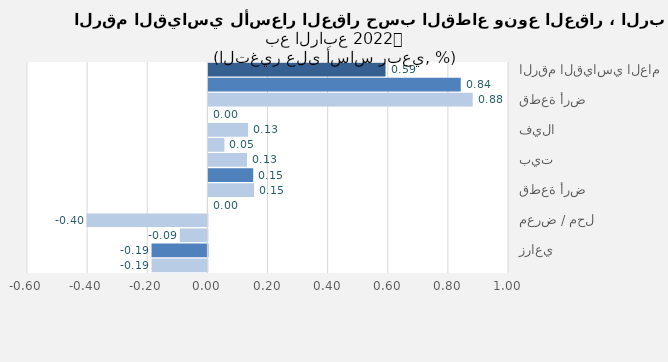
| Category | Series 0 |
|---|---|
| الرقم القياسي العام | 0.589 |
| سكني | 0.839 |
| قطعة أرض | 0.879 |
| عمارة | 0 |
| فيلا | 0.132 |
| شقة | 0.053 |
| بيت | 0.128 |
| تجاري | 0.149 |
| قطعة أرض | 0.152 |
| عمارة | 0 |
| معرض / محل | -0.402 |
| مركز تجاري | -0.092 |
| زراعي | -0.186 |
| ارض زراعية | -0.186 |